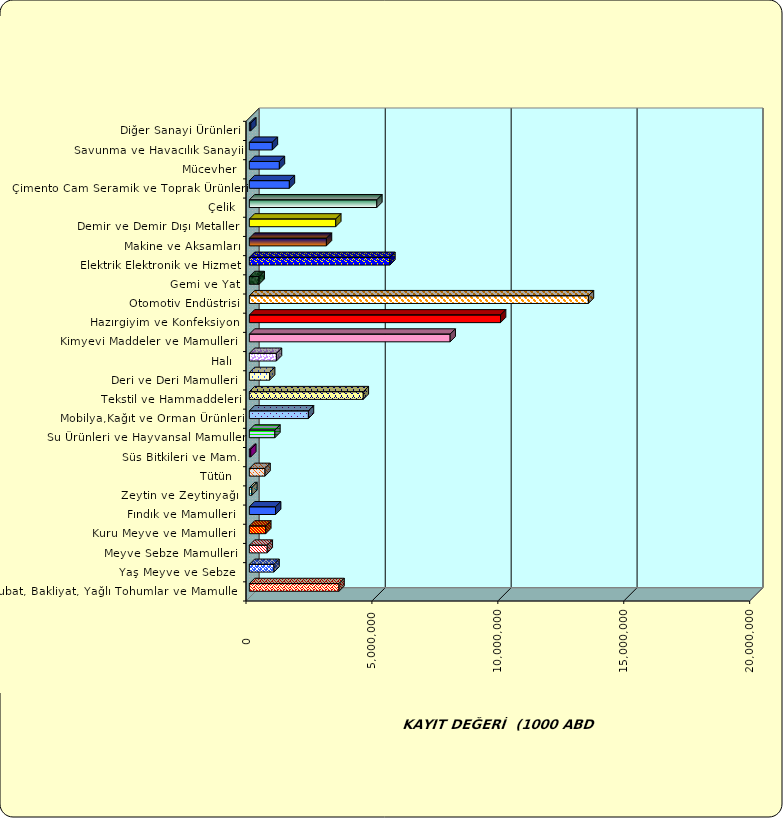
| Category | Series 0 |
|---|---|
|  Hububat, Bakliyat, Yağlı Tohumlar ve Mamulleri  | 3560911.734 |
|  Yaş Meyve ve Sebze   | 978311.452 |
|  Meyve Sebze Mamulleri  | 710342.343 |
|  Kuru Meyve ve Mamulleri   | 651673.574 |
|  Fındık ve Mamulleri  | 1041382.633 |
|  Zeytin ve Zeytinyağı  | 98278.385 |
|  Tütün  | 621574.969 |
|  Süs Bitkileri ve Mam. | 55541.984 |
|  Su Ürünleri ve Hayvansal Mamuller | 1013399.59 |
|  Mobilya,Kağıt ve Orman Ürünleri | 2345416.95 |
|  Tekstil ve Hammaddeleri | 4523815.642 |
|  Deri ve Deri Mamulleri  | 803872.412 |
|  Halı  | 1075026.509 |
|  Kimyevi Maddeler ve Mamulleri   | 7973259.44 |
|  Hazırgiyim ve Konfeksiyon  | 9974045.19 |
|  Otomotiv Endüstrisi | 13462967.092 |
|  Gemi ve Yat | 388568.043 |
|  Elektrik Elektronik ve Hizmet | 5579995.095 |
|  Makine ve Aksamları | 3060787.812 |
|  Demir ve Demir Dışı Metaller  | 3430332.81 |
|  Çelik | 5061591.492 |
|  Çimento Cam Seramik ve Toprak Ürünleri | 1589087.727 |
|  Mücevher | 1192502.996 |
|  Savunma ve Havacılık Sanayii | 913221.62 |
|  Diğer Sanayi Ürünleri | 57850.297 |